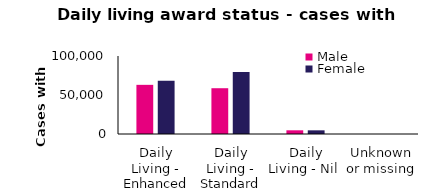
| Category | Male | Female |
|---|---|---|
| Daily Living - Enhanced | 63023 | 68427 |
| Daily Living - Standard | 58697 | 79448 |
| Daily Living - Nil  | 4744 | 4707 |
| Unknown or missing | 9 | 8 |